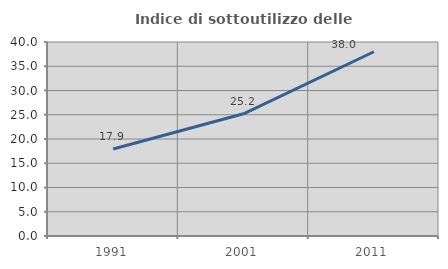
| Category | Indice di sottoutilizzo delle abitazioni  |
|---|---|
| 1991.0 | 17.939 |
| 2001.0 | 25.199 |
| 2011.0 | 37.989 |